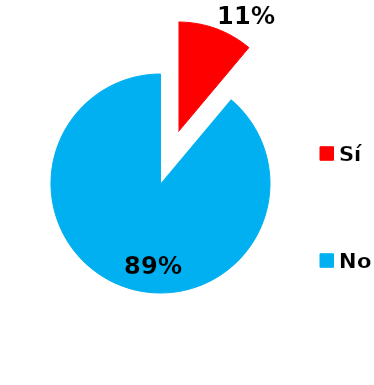
| Category | Series 0 |
|---|---|
| Sí | 4 |
| No | 32 |